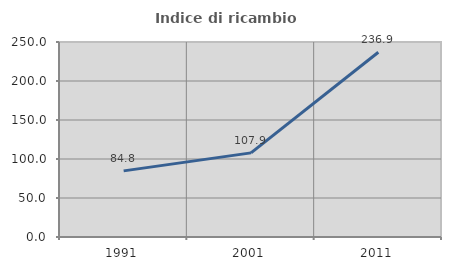
| Category | Indice di ricambio occupazionale  |
|---|---|
| 1991.0 | 84.758 |
| 2001.0 | 107.864 |
| 2011.0 | 236.871 |